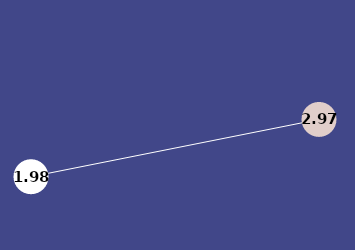
| Category | Series 0 |
|---|---|
| 0 | 1.983 |
| 1 | 2.967 |